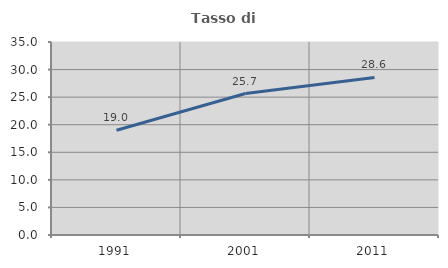
| Category | Tasso di occupazione   |
|---|---|
| 1991.0 | 18.989 |
| 2001.0 | 25.653 |
| 2011.0 | 28.579 |